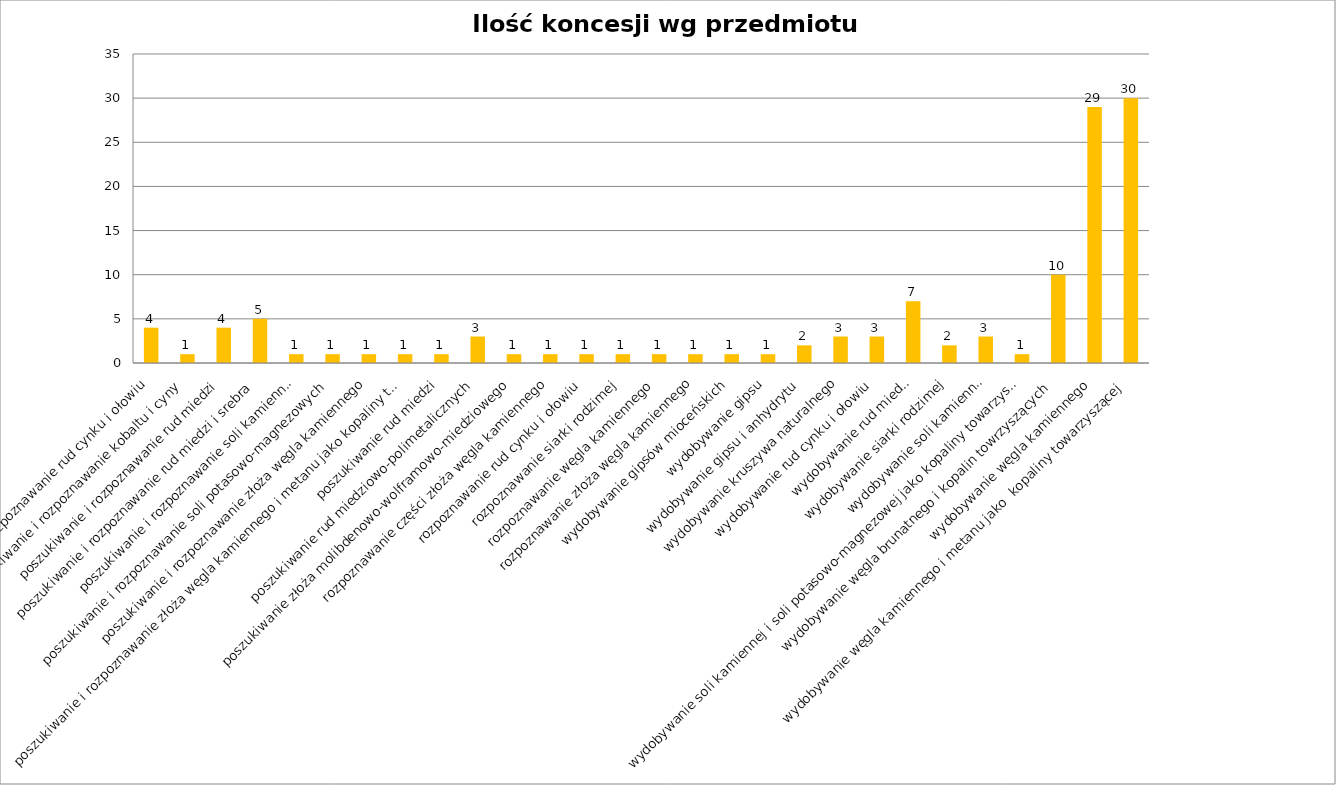
| Category | Ilość koncesji |
|---|---|
| poszukiwanie i rozpoznawanie rud cynku i ołowiu | 4 |
| poszukiwanie i rozpoznawanie kobaltu i cyny | 1 |
| poszukiwanie i rozpoznawanie rud miedzi | 4 |
| poszukiwanie i rozpoznawanie rud miedzi i srebra | 5 |
| poszukiwanie i rozpoznawanie soli kamiennej | 1 |
| poszukiwanie i rozpoznawanie soli potasowo-magnezowych | 1 |
| poszukiwanie i rozpoznawanie złoża węgla kamiennego | 1 |
| poszukiwanie i rozpoznawanie złoża węgla kamiennego i metanu jako kopaliny towarzyszącej | 1 |
| poszukiwanie rud miedzi | 1 |
| poszukiwanie rud miedziowo-polimetalicznych | 3 |
| poszukiwanie złoża molibdenowo-wolframowo-miedziowego | 1 |
| rozpoznawanie części złoża węgla kamiennego | 1 |
| rozpoznawanie rud cynku i ołowiu | 1 |
| rozpoznawanie siarki rodzimej | 1 |
| rozpoznawanie węgla kamiennego | 1 |
| rozpoznawanie złoża węgla kamiennego | 1 |
| wydobywanie gipsów mioceńskich | 1 |
| wydobywanie gipsu | 1 |
| wydobywanie gipsu i anhydrytu | 2 |
| wydobywanie kruszywa naturalnego | 3 |
| wydobywanie rud cynku i ołowiu | 3 |
| wydobywanie rud miedzi | 7 |
| wydobywanie siarki rodzimej | 2 |
| wydobywanie soli kamiennej | 3 |
| wydobywanie soli kamiennej i soli potasowo-magnezowej jako kopaliny towarzyszącej | 1 |
| wydobywanie węgla brunatnego i kopalin towrzyszących | 10 |
| wydobywanie węgla kamiennego | 29 |
| wydobywanie węgla kamiennego i metanu jako  kopaliny towarzyszącej | 30 |